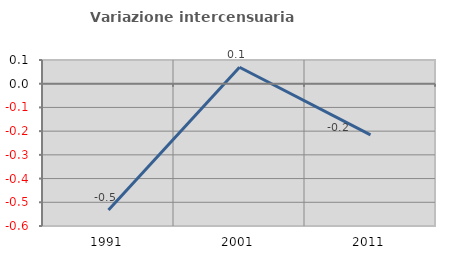
| Category | Variazione intercensuaria annua |
|---|---|
| 1991.0 | -0.533 |
| 2001.0 | 0.069 |
| 2011.0 | -0.216 |